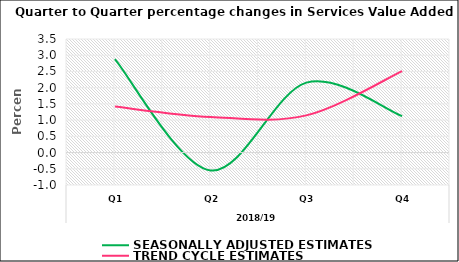
| Category | SEASONALLY ADJUSTED ESTIMATES | TREND CYCLE ESTIMATES |
|---|---|---|
| 0 | 2.881 | 1.416 |
| 1 | -0.551 | 1.098 |
| 2 | 2.155 | 1.145 |
| 3 | 1.124 | 2.509 |